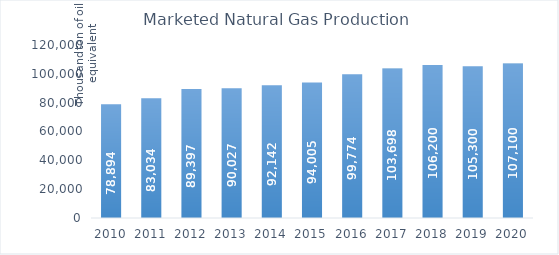
| Category | Marketed Natural Gas Production |
|---|---|
| 2010.0 | 78894 |
| 2011.0 | 83034 |
| 2012.0 | 89397 |
| 2013.0 | 90027 |
| 2014.0 | 92142 |
| 2015.0 | 94005 |
| 2016.0 | 99774 |
| 2017.0 | 103698 |
| 2018.0 | 106200 |
| 2019.0 | 105300 |
| 2020.0 | 107100 |